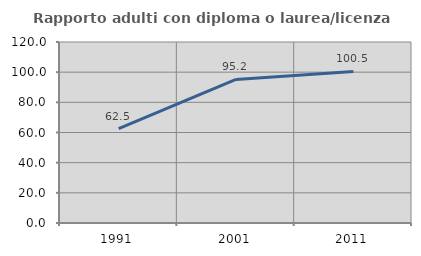
| Category | Rapporto adulti con diploma o laurea/licenza media  |
|---|---|
| 1991.0 | 62.5 |
| 2001.0 | 95.181 |
| 2011.0 | 100.478 |